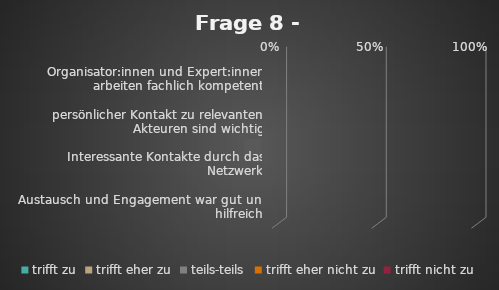
| Category | trifft zu | trifft eher zu | teils-teils | trifft eher nicht zu | trifft nicht zu |
|---|---|---|---|---|---|
| Organisator:innen und Expert:innen arbeiten fachlich kompetent | 0 | 0 | 0 | 0 | 0 |
| persönlicher Kontakt zu relevanten Akteuren sind wichtig | 0 | 0 | 0 | 0 | 0 |
| Interessante Kontakte durch das Netzwerk | 0 | 0 | 0 | 0 | 0 |
| Austausch und Engagement war gut und hilfreich | 0 | 0 | 0 | 0 | 0 |